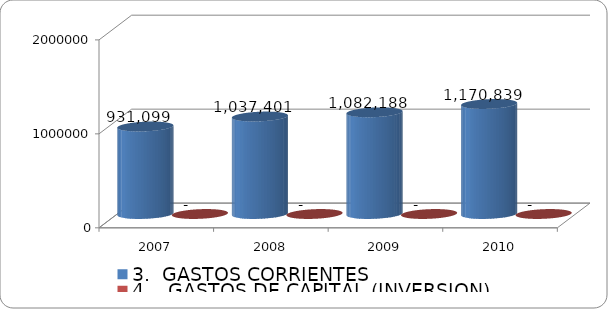
| Category | 3.  GASTOS CORRIENTES | 4.   GASTOS DE CAPITAL (INVERSION) |
|---|---|---|
| 2007 | 931099.204 | 0 |
| 2008 | 1037401.381 | 0 |
| 2009 | 1082188.303 | 0 |
| 2010 | 1170839 | 0 |